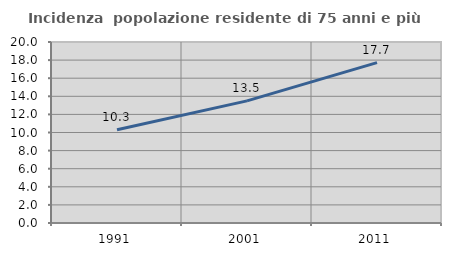
| Category | Incidenza  popolazione residente di 75 anni e più |
|---|---|
| 1991.0 | 10.311 |
| 2001.0 | 13.493 |
| 2011.0 | 17.717 |